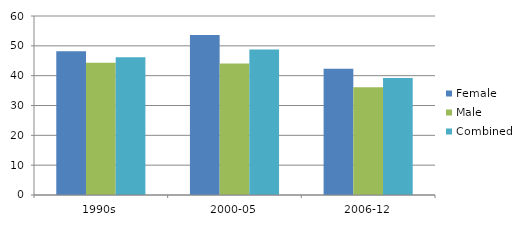
| Category | Female | Male | Combined |
|---|---|---|---|
| 1990s | 48.2 | 44.3 | 46.2 |
| 2000-05 | 53.6 | 44.1 | 48.8 |
| 2006-12 | 42.3 | 36.1 | 39.2 |